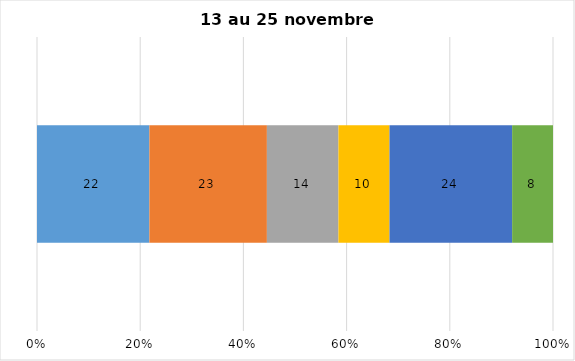
| Category | Plusieurs fois par jour | Une fois par jour | Quelques fois par semaine   | Une fois par semaine ou moins   |  Jamais   |  Je n’utilise pas les médias sociaux |
|---|---|---|---|---|---|---|
| 0 | 22 | 23 | 14 | 10 | 24 | 8 |